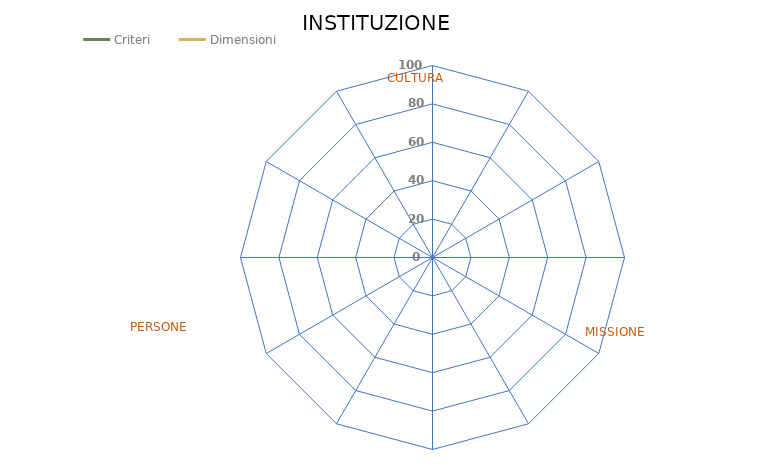
| Category | Criteri |
|---|---|
| GOVERNANCE | 0 |
| STRATEGIA | 0 |
| CONTESTO INCLUSIVO | 0 |
| MISURAZIONE | 0 |
| CURRICULA | 0 |
| RICERCA | 0 |
| TERZA MISSIONE | 0 |
| FINANZIAMENTO | 0 |
| IDENTIFICAZIONE | 0 |
| CONSULTAZIONE | 0 |
| COINVOLGIMENTO | 0 |
| CO-CREAZIONE | 0 |